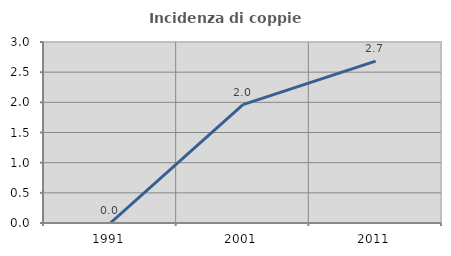
| Category | Incidenza di coppie miste |
|---|---|
| 1991.0 | 0 |
| 2001.0 | 1.961 |
| 2011.0 | 2.683 |